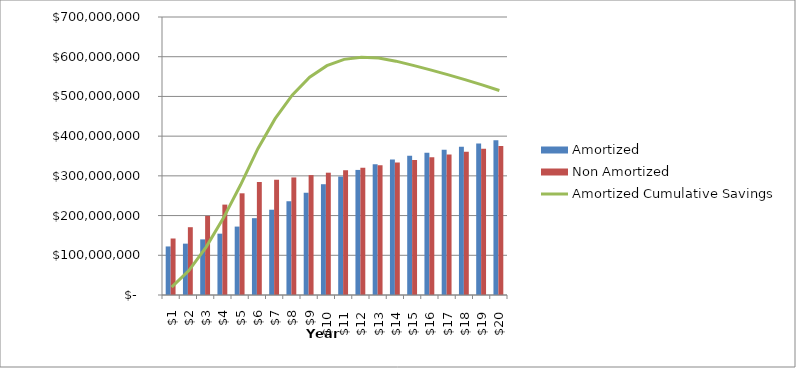
| Category | Amortized | Non Amortized |
|---|---|---|
| 0 | 122250068.508 | 142260000 |
| 1 | 129301219.122 | 170712000 |
| 2 | 140068895.965 | 199164000 |
| 3 | 154431808.161 | 227616000 |
| 4 | 172268664.834 | 256068000 |
| 5 | 193458175.109 | 284520000 |
| 6 | 214729593.802 | 290210400 |
| 7 | 236074410.009 | 296014608 |
| 8 | 257483942.609 | 301934900.16 |
| 9 | 278949336.858 | 307973598.163 |
| 10 | 298238235.195 | 314133070.126 |
| 11 | 314939842.52 | 320415731.529 |
| 12 | 329166052.984 | 326824046.16 |
| 13 | 341028572.803 | 333360527.083 |
| 14 | 350638916.5 | 340027737.624 |
| 15 | 358108403.071 | 346828292.377 |
| 16 | 365727279.374 | 353764858.224 |
| 17 | 373498533.203 | 360840155.389 |
| 18 | 381425212.108 | 368056958.497 |
| 19 | 389510424.591 | 375418097.667 |